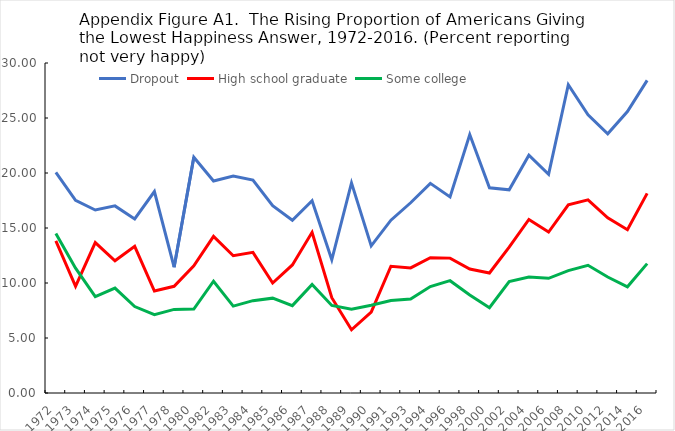
| Category | Dropout | High school graduate | Some college |
|---|---|---|---|
| 1972.0 | 20.063 | 13.834 | 14.502 |
| 1973.0 | 17.518 | 9.691 | 11.349 |
| 1974.0 | 16.634 | 13.673 | 8.768 |
| 1975.0 | 17.009 | 12.024 | 9.534 |
| 1976.0 | 15.819 | 13.333 | 7.86 |
| 1977.0 | 18.312 | 9.27 | 7.127 |
| 1978.0 | 11.435 | 9.701 | 7.6 |
| 1980.0 | 21.429 | 11.554 | 7.631 |
| 1982.0 | 19.275 | 14.239 | 10.159 |
| 1983.0 | 19.728 | 12.477 | 7.899 |
| 1984.0 | 19.363 | 12.788 | 8.393 |
| 1985.0 | 17.026 | 10 | 8.624 |
| 1986.0 | 15.7 | 11.642 | 7.942 |
| 1987.0 | 17.474 | 14.609 | 9.863 |
| 1988.0 | 12.113 | 8.667 | 7.962 |
| 1989.0 | 19.101 | 5.749 | 7.613 |
| 1990.0 | 13.378 | 7.356 | 7.974 |
| 1991.0 | 15.71 | 11.522 | 8.415 |
| 1993.0 | 17.296 | 11.368 | 8.54 |
| 1994.0 | 19.056 | 12.298 | 9.673 |
| 1996.0 | 17.828 | 12.262 | 10.212 |
| 1998.0 | 23.493 | 11.269 | 8.907 |
| 2000.0 | 18.658 | 10.907 | 7.749 |
| 2002.0 | 18.468 | 13.268 | 10.135 |
| 2004.0 | 21.622 | 15.775 | 10.54 |
| 2006.0 | 19.88 | 14.628 | 10.426 |
| 2008.0 | 28.024 | 17.098 | 11.121 |
| 2010.0 | 25.291 | 17.563 | 11.609 |
| 2012.0 | 23.567 | 15.926 | 10.541 |
| 2014.0 | 25.587 | 14.847 | 9.658 |
| 2016.0 | 28.421 | 18.149 | 11.761 |